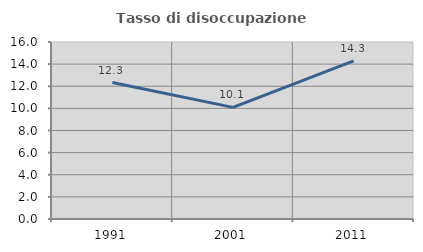
| Category | Tasso di disoccupazione giovanile  |
|---|---|
| 1991.0 | 12.338 |
| 2001.0 | 10.092 |
| 2011.0 | 14.286 |